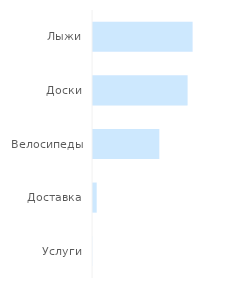
| Category | Ноль | Выручка | Себестоимость | Валовая прибыль |
|---|---|---|---|---|
| Лыжи | 0 | 0 | 0 | 72913.691 |
| Доски | 0 | 0 | 0 | 69262.596 |
| Велосипеды | 0 | 0 | 0 | 48768.394 |
| Доставка | 0 | 0 | 0 | 3396.69 |
| Услуги | 0 | 0 | 0 | 211.491 |